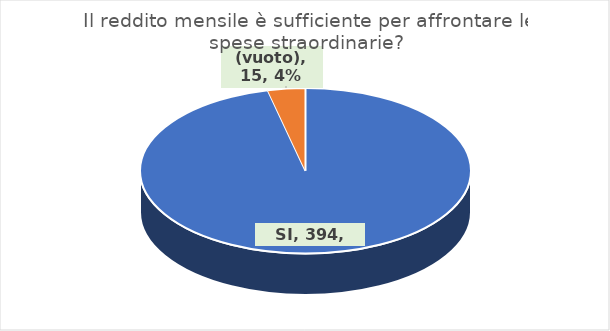
| Category | Series 0 |
|---|---|
| SI | 394 |
| (vuoto) | 15 |